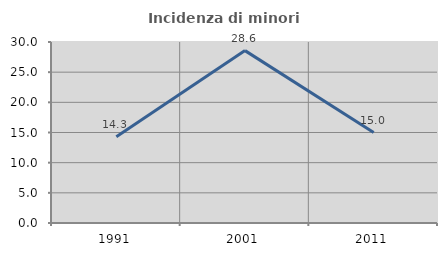
| Category | Incidenza di minori stranieri |
|---|---|
| 1991.0 | 14.286 |
| 2001.0 | 28.571 |
| 2011.0 | 15 |